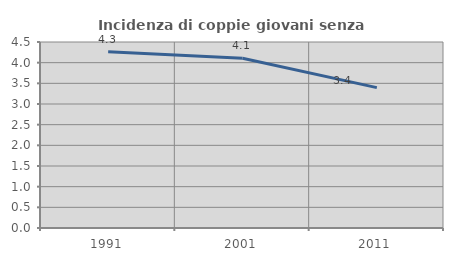
| Category | Incidenza di coppie giovani senza figli |
|---|---|
| 1991.0 | 4.265 |
| 2001.0 | 4.106 |
| 2011.0 | 3.397 |